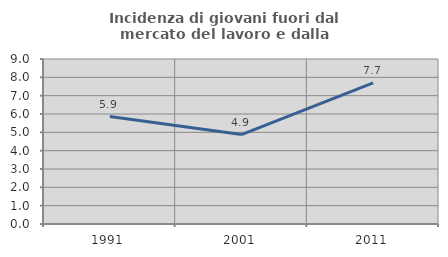
| Category | Incidenza di giovani fuori dal mercato del lavoro e dalla formazione  |
|---|---|
| 1991.0 | 5.859 |
| 2001.0 | 4.878 |
| 2011.0 | 7.692 |